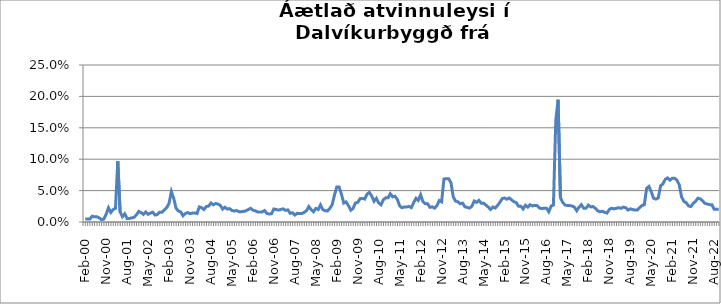
| Category | Series 0 |
|---|---|
| feb.00 | 0.005 |
| mar.00 | 0.005 |
| apr.00 | 0.005 |
| maí.00 | 0.009 |
| jún.00 | 0.008 |
| júl.00 | 0.008 |
| ágú.00 | 0.007 |
| sep.00 | 0.004 |
| okt.00 | 0.005 |
| nóv.00 | 0.012 |
| des.00 | 0.023 |
| jan.01 | 0.015 |
| feb.01 | 0.02 |
| mar.01 | 0.022 |
| apr.01 | 0.097 |
| maí.01 | 0.016 |
| jún.01 | 0.008 |
| júl.01 | 0.013 |
| ágú.01 | 0.006 |
| sep.01 | 0.006 |
| okt.01 | 0.007 |
| nóv.01 | 0.007 |
| des.01 | 0.011 |
| jan.02 | 0.017 |
| feb.02 | 0.015 |
| mar.02 | 0.012 |
| apr.02 | 0.016 |
| maí.02 | 0.012 |
| jún.02 | 0.014 |
| júl.02 | 0.016 |
| ágú.02 | 0.011 |
| sep.02 | 0.012 |
| okt.02 | 0.016 |
| nóv.02 | 0.016 |
| des.02 | 0.019 |
| jan.03 | 0.023 |
| feb.03 | 0.029 |
| mar.03 | 0.049 |
| apr.03 | 0.038 |
| maí.03 | 0.022 |
| jún.03 | 0.018 |
| júl.03 | 0.016 |
| ágú.03 | 0.01 |
| sep.03 | 0.013 |
| okt.03 | 0.015 |
| nóv.03 | 0.013 |
| des.03 | 0.014 |
| jan.04 | 0.014 |
| feb.04 | 0.013 |
| mar.04 | 0.024 |
| apr.04 | 0.023 |
| maí.04 | 0.02 |
| jún.04 | 0.025 |
| júl.04 | 0.025 |
| ágú.04 | 0.03 |
| sep.04 | 0.027 |
| okt.04 | 0.03 |
| nóv.04 | 0.029 |
| des.04 | 0.027 |
| jan.05 | 0.021 |
| feb.05 | 0.024 |
| mar.05 | 0.021 |
| apr.05 | 0.021 |
| maí.05 | 0.018 |
| jún.05 | 0.017 |
| júl.05 | 0.018 |
| ágú.05 | 0.016 |
| sep.05 | 0.016 |
| okt.05 | 0.017 |
| nóv.05 | 0.018 |
| des.05 | 0.02 |
| jan.06 | 0.022 |
| feb.06 | 0.019 |
| mar.06 | 0.018 |
| apr.06 | 0.016 |
| maí.06 | 0.016 |
| jún.06 | 0.016 |
| júl.06 | 0.018 |
| ágú.06 | 0.014 |
| sep.06 | 0.013 |
| okt.06 | 0.013 |
| nóv.06 | 0.021 |
| des.06 | 0.02 |
| jan.07 | 0.019 |
| feb.07 | 0.02 |
| mar.07 | 0.021 |
| apr.07 | 0.018 |
| maí.07 | 0.019 |
| jún.07 | 0.014 |
| júl.07 | 0.015 |
| ágú.07 | 0.011 |
| sep.07 | 0.014 |
| okt.07 | 0.013 |
| nóv.07 | 0.013 |
| des.07 | 0.015 |
| jan.08 | 0.018 |
| feb.08 | 0.025 |
| mar.08 | 0.02 |
| apr.08 | 0.016 |
| maí.08 | 0.022 |
| jún.08 | 0.02 |
| júl.08 | 0.027 |
| ágú.08 | 0.02 |
| sep.08 | 0.018 |
| okt.08 | 0.018 |
| nóv.08 | 0.022 |
| des.08 | 0.027 |
| jan.09 | 0.043 |
| feb.09 | 0.056 |
| mar.09 | 0.056 |
| apr.09 | 0.044 |
| maí.09 | 0.03 |
| jún.09 | 0.032 |
| júl.09 | 0.026 |
| ágú.09 | 0.019 |
| sep.09 | 0.022 |
| okt.09 | 0.03 |
| nóv.09 | 0.031 |
| des.09 | 0.037 |
| jan.10 | 0.038 |
| feb.10 | 0.037 |
| mar.10 | 0.044 |
| apr.10 | 0.047 |
| maí.10 | 0.041 |
| jún.10 | 0.033 |
| júl.10 | 0.038 |
| ágú.10 | 0.03 |
| sep.10 | 0.027 |
| okt.10 | 0.036 |
| nóv.10 | 0.038 |
| des.10 | 0.038 |
| jan.11 | 0.045 |
| feb.11 | 0.04 |
| mar.11 | 0.041 |
| apr.11 | 0.036 |
| maí.11 | 0.026 |
| jún.11 | 0.023 |
| júl.11 | 0.024 |
| ágú.11 | 0.024 |
| sep.11 | 0.025 |
| okt.11 | 0.023 |
| nóv.11 | 0.031 |
| des.11 | 0.038 |
| jan.12 | 0.034 |
| feb.12 | 0.044 |
| mar.12 | 0.032 |
| apr.12 | 0.029 |
| maí.12 | 0.029 |
| jún.12 | 0.023 |
| júl.12 | 0.024 |
| ágú.12 | 0.022 |
| sep.12 | 0.026 |
| okt.12 | 0.034 |
| nóv.12 | 0.032 |
| des.12 | 0.068 |
| jan.13 | 0.069 |
| feb.13 | 0.069 |
| mar.13 | 0.063 |
| apr.13 | 0.04 |
| maí.13 | 0.033 |
| jún.13 | 0.032 |
| júl.13 | 0.029 |
| ágú.13 | 0.03 |
| sep.13 | 0.024 |
| okt.13 | 0.023 |
| nóv.13 | 0.022 |
| des.13 | 0.025 |
| jan.14 | 0.033 |
| feb.14 | 0.031 |
| mar.14 | 0.034 |
| apr.14 | 0.03 |
| maí.14 | 0.03 |
| jún.14 | 0.027 |
| júl.14 | 0.024 |
| ágú.14 | 0.02 |
| sep.14 | 0.024 |
| okt.14 | 0.022 |
| nóv.14 | 0.026 |
| des.14 | 0.031 |
| jan.15 | 0.037 |
| feb.15 | 0.038 |
| mar.15 | 0.036 |
| apr.15 | 0.038 |
| maí.15 | 0.035 |
| jún.15 | 0.032 |
| júl.15 | 0.031 |
| ágú.15 | 0.025 |
| sep.15 | 0.025 |
| okt.15 | 0.021 |
| nóv.15 | 0.027 |
| des.15 | 0.024 |
| jan.16 | 0.028 |
| feb.16 | 0.026 |
| mar.16 | 0.027 |
| apr.16 | 0.026 |
| maí.16 | 0.022 |
| jún.16 | 0.021 |
| júl.16 | 0.022 |
| ágú.16 | 0.022 |
| sep.16 | 0.016 |
| okt.16 | 0.025 |
| nóv.16 | 0.027 |
| des.16 | 0.161 |
| jan.17 | 0.195 |
| feb.17 | 0.039 |
| mar.17 | 0.031 |
| apr.17 | 0.027 |
| maí.17 | 0.026 |
| jún.17 | 0.026 |
| júl.17 | 0.025 |
| ágú.17 | 0.024 |
| sep.17 | 0.018 |
| okt.17 | 0.024 |
| nóv.17 | 0.028 |
| des.17 | 0.022 |
| jan.18 | 0.022 |
| feb.18 | 0.027 |
| mar.18 | 0.024 |
| apr.18 | 0.025 |
| maí.18 | 0.022 |
| jún.18 | 0.018 |
| júl.18 | 0.016 |
| ágú.18 | 0.017 |
| sep.18 | 0.015 |
| okt.18 | 0.014 |
| nóv.18 | 0.02 |
| des.18 | 0.022 |
| jan.19 | 0.021 |
| feb.19 | 0.022 |
| mar.19 | 0.023 |
| apr.19 | 0.022 |
| maí.19 | 0.024 |
| jún.19 | 0.023 |
| júl.19 | 0.019 |
| ágú.19 | 0.021 |
| sep.19 | 0.02 |
| okt.19 | 0.019 |
| nóv.19 | 0.019 |
| des.19 | 0.023 |
| jan.20 | 0.026 |
| feb.20 | 0.027 |
| mar.2020* | 0.054 |
| apr.20 | 0.057 |
| maí.20 | 0.048 |
| jún.20 | 0.038 |
| júl.20 | 0.036 |
| ágú.20 | 0.038 |
| sep.20 | 0.058 |
| okt.20 | 0.061 |
| nóv.20 | 0.068 |
| des.20 | 0.07 |
| jan.21 | 0.067 |
| feb.21 | 0.07 |
| mar.21 | 0.07 |
| apr.21 | 0.067 |
| maí.21 | 0.059 |
| jún.21 | 0.04 |
| júl.21 | 0.033 |
| ágú.21 | 0.031 |
| sep.21 | 0.026 |
| okt.21 | 0.025 |
| nóv.21 | 0.03 |
| des.21 | 0.033 |
| jan.22 | 0.038 |
| feb.22 | 0.037 |
| mar.22 | 0.034 |
| apr.22 | 0.03 |
| maí.22 | 0.029 |
| jún.22 | 0.028 |
| júl.22 | 0.028 |
| ágú.22 | 0.02 |
| sep.22 | 0.02 |
| okt.22 | 0.02 |